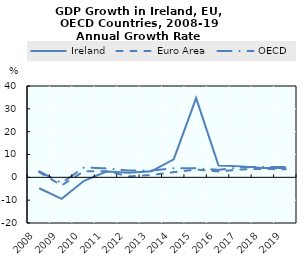
| Category | Ireland | Euro Area | OECD |
|---|---|---|---|
| 2008.0 | -4.787 | 2.269 | 2.644 |
| 2009.0 | -9.421 | -3.528 | -2.463 |
| 2010.0 | -1.51 | 2.688 | 4.347 |
| 2011.0 | 2.57 | 2.661 | 3.892 |
| 2012.0 | 2.058 | 0.416 | 2.958 |
| 2013.0 | 2.618 | 1.027 | 2.96 |
| 2014.0 | 7.87 | 2.26 | 3.984 |
| 2015.0 | 34.699 | 3.409 | 4.024 |
| 2016.0 | 5.178 | 2.574 | 3.281 |
| 2017.0 | 4.8 | 3.458 | 4.419 |
| 2018.0 | 4.037 | 3.682 | 4.554 |
| 2019.0 | 4.078 | 3.54 | 4.464 |